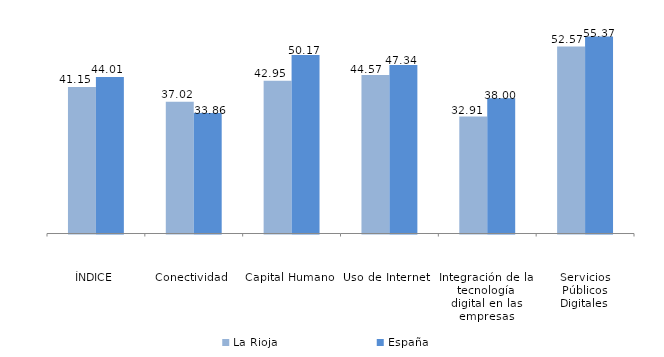
| Category | La Rioja | España |
|---|---|---|
| ÍNDICE | 41.15 | 44.01 |
| Conectividad | 37.02 | 33.86 |
| Capital Humano  | 42.95 | 50.17 |
| Uso de Internet | 44.57 | 47.34 |
| Integración de la tecnología digital en las empresas | 32.91 | 38 |
| Servicios Públicos Digitales | 52.57 | 55.37 |